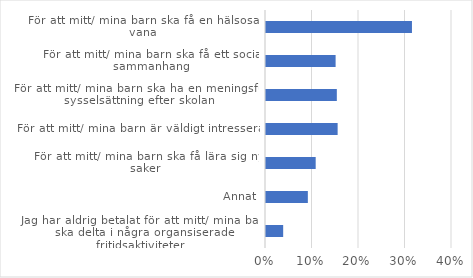
| Category | Series 0 |
|---|---|
| Jag har aldrig betalat för att mitt/ mina barn ska delta i några organsiserade fritidsaktiviteter | 0.037 |
| Annat | 0.09 |
| För att mitt/ mina barn ska få lära sig nya saker | 0.107 |
| För att mitt/ mina barn är väldigt intresserat | 0.154 |
| För att mitt/ mina barn ska ha en meningsfull sysselsättning efter skolan | 0.152 |
| För att mitt/ mina barn ska få ett socialt sammanhang | 0.15 |
| För att mitt/ mina barn ska få en hälsosam vana | 0.314 |